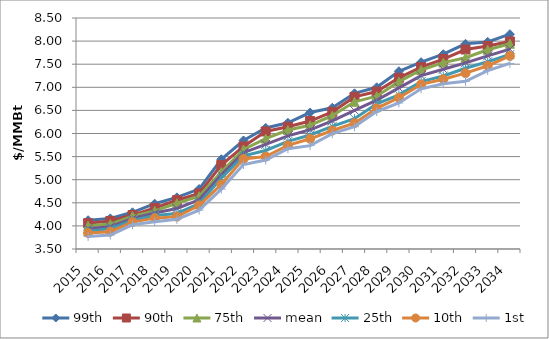
| Category | 99th | 90th | 75th | mean | 25th | 10th | 1st |
|---|---|---|---|---|---|---|---|
| 2015.0 | 4.122 | 4.059 | 4.002 | 3.944 | 3.882 | 3.845 | 3.772 |
| 2016.0 | 4.162 | 4.108 | 4.039 | 3.984 | 3.94 | 3.875 | 3.803 |
| 2017.0 | 4.294 | 4.234 | 4.212 | 4.159 | 4.115 | 4.082 | 4.024 |
| 2018.0 | 4.48 | 4.388 | 4.325 | 4.279 | 4.227 | 4.168 | 4.089 |
| 2019.0 | 4.618 | 4.556 | 4.49 | 4.377 | 4.269 | 4.2 | 4.142 |
| 2020.0 | 4.798 | 4.702 | 4.641 | 4.564 | 4.481 | 4.442 | 4.342 |
| 2021.0 | 5.442 | 5.319 | 5.164 | 5.104 | 5.034 | 4.895 | 4.797 |
| 2022.0 | 5.849 | 5.72 | 5.653 | 5.585 | 5.518 | 5.45 | 5.327 |
| 2023.0 | 6.121 | 6.044 | 5.89 | 5.766 | 5.633 | 5.5 | 5.425 |
| 2024.0 | 6.232 | 6.146 | 6.075 | 5.948 | 5.829 | 5.744 | 5.671 |
| 2025.0 | 6.453 | 6.27 | 6.179 | 6.08 | 5.968 | 5.885 | 5.738 |
| 2026.0 | 6.557 | 6.469 | 6.385 | 6.272 | 6.156 | 6.064 | 5.999 |
| 2027.0 | 6.87 | 6.792 | 6.686 | 6.499 | 6.32 | 6.224 | 6.148 |
| 2028.0 | 7 | 6.908 | 6.807 | 6.721 | 6.643 | 6.545 | 6.475 |
| 2029.0 | 7.347 | 7.206 | 7.123 | 6.987 | 6.836 | 6.775 | 6.661 |
| 2030.0 | 7.544 | 7.436 | 7.375 | 7.253 | 7.125 | 7.063 | 6.966 |
| 2031.0 | 7.716 | 7.61 | 7.535 | 7.39 | 7.245 | 7.174 | 7.077 |
| 2032.0 | 7.941 | 7.818 | 7.641 | 7.53 | 7.411 | 7.306 | 7.13 |
| 2033.0 | 7.982 | 7.894 | 7.812 | 7.681 | 7.553 | 7.466 | 7.363 |
| 2034.0 | 8.149 | 7.993 | 7.943 | 7.827 | 7.71 | 7.678 | 7.517 |